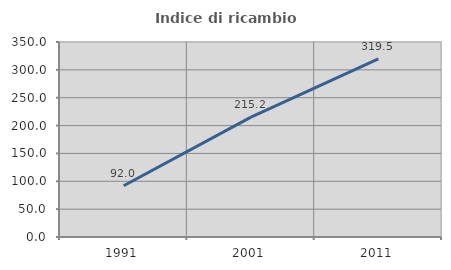
| Category | Indice di ricambio occupazionale  |
|---|---|
| 1991.0 | 92 |
| 2001.0 | 215.152 |
| 2011.0 | 319.512 |